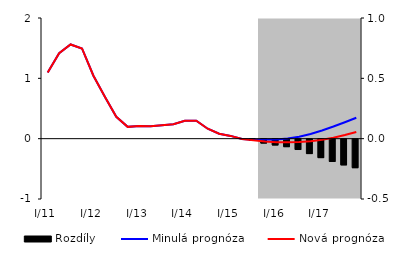
| Category | Rozdíly |
|---|---|
| 0 | 0 |
| 1 | 0 |
| 2 | 0 |
| 3 | 0 |
| 4 | 0 |
| 5 | 0 |
| 6 | 0 |
| 7 | 0 |
| 8 | 0 |
| 9 | 0 |
| 10 | 0 |
| 11 | 0 |
| 12 | 0 |
| 13 | 0 |
| 14 | 0 |
| 15 | 0 |
| 16 | 0 |
| 17 | 0 |
| 18 | -0.011 |
| 19 | -0.032 |
| 20 | -0.048 |
| 21 | -0.062 |
| 22 | -0.086 |
| 23 | -0.119 |
| 24 | -0.153 |
| 25 | -0.185 |
| 26 | -0.213 |
| 27 | -0.236 |